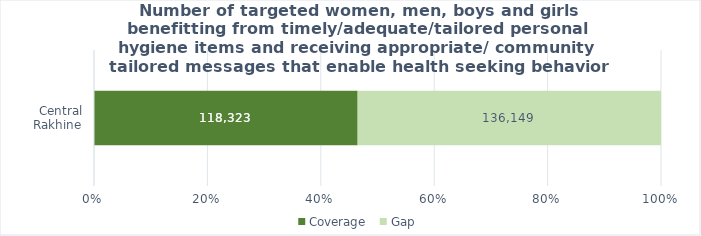
| Category | Coverage | Gap |
|---|---|---|
|  Central Rakhine  | 118323 | 136149 |